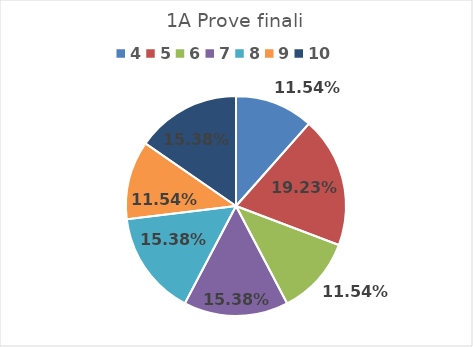
| Category | 1A |
|---|---|
| 4.0 | 0.115 |
| 5.0 | 0.192 |
| 6.0 | 0.115 |
| 7.0 | 0.154 |
| 8.0 | 0.154 |
| 9.0 | 0.115 |
| 10.0 | 0.154 |